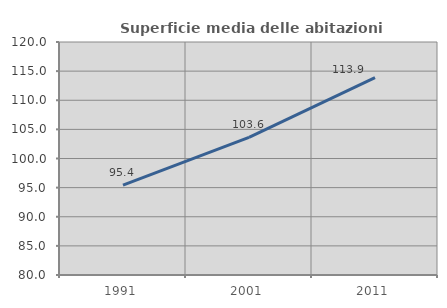
| Category | Superficie media delle abitazioni occupate |
|---|---|
| 1991.0 | 95.425 |
| 2001.0 | 103.642 |
| 2011.0 | 113.888 |